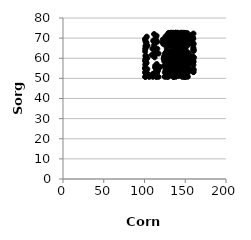
| Category | Series 0 |
|---|---|
| 136.72777560908997 | 69.507 |
| 130.25405878217626 | 67.39 |
| 138.38169360817292 | 51.266 |
| 147.95466621825304 | 70.231 |
| 157.93652203945828 | 68.69 |
| 145.1142160764156 | 61.77 |
| 102.15362811644198 | 61.149 |
| 127.79622655462948 | 69.228 |
| 159.40141447130028 | 59.395 |
| 139.8572153171643 | 65.665 |
| 140.04410825100643 | 63.404 |
| 125.28839167046857 | 58.538 |
| 154.35502141300222 | 67.321 |
| 101.50018633640991 | 53.443 |
| 126.73089541599688 | 68.853 |
| 133.78302110138736 | 56.378 |
| 100.81534180641341 | 54.749 |
| 135.9106538261241 | 53.562 |
| 144.70163184472543 | 69.403 |
| 137.67380770594968 | 58.314 |
| 125.8161522658447 | 54.197 |
| 144.47358134687306 | 70.509 |
| 101.28371883580245 | 58.985 |
| 116.55865361353845 | 54.092 |
| 150.19531930577875 | 68.508 |
| 127.9652267120658 | 50.885 |
| 132.53426273231733 | 59.396 |
| 132.25624815754523 | 60.445 |
| 147.7332097175809 | 61.745 |
| 134.77266203290574 | 60.467 |
| 130.50245933845278 | 72.513 |
| 128.92963068216812 | 67.349 |
| 128.07707935208498 | 58.422 |
| 159.48881929468297 | 70.04 |
| 101.25255429634939 | 65.175 |
| 102.60515078731365 | 57.702 |
| 152.03792089943082 | 70.535 |
| 147.36515889946048 | 70.09 |
| 132.33229366168916 | 55.952 |
| 123.28457222858277 | 68.918 |
| 160.3874768311301 | 60.376 |
| 100.71342991222684 | 52.929 |
| 137.7502930527938 | 70.521 |
| 111.45653751353935 | 52.238 |
| 133.23792423907062 | 61.976 |
| 124.28939290886308 | 58.458 |
| 150.37475608348595 | 70.229 |
| 145.82940093065787 | 66.606 |
| 134.61403264303803 | 63.3 |
| 102.78140307507637 | 70.729 |
| 147.80649185456153 | 67.702 |
| 135.07020181585025 | 56.597 |
| 134.94941046811618 | 54.104 |
| 127.94194534569507 | 56.036 |
| 105.71737378688425 | 50.742 |
| 150.35580454033305 | 52.365 |
| 151.16893175716208 | 55.976 |
| 142.37378215201423 | 67.616 |
| 149.49649763692324 | 71.825 |
| 134.2863159495147 | 60.282 |
| 139.28961793121934 | 67.959 |
| 136.24550839912322 | 71.152 |
| 133.08947951596048 | 55.778 |
| 153.78992681641517 | 61.882 |
| 160.0875590081285 | 53.113 |
| 149.54992638110843 | 65.933 |
| 148.02626354366294 | 69.292 |
| 141.4202918124553 | 69.028 |
| 151.8277004785291 | 69.604 |
| 140.81856470674865 | 62.005 |
| 130.8034514433382 | 68.269 |
| 135.4874719952224 | 59.609 |
| 133.58334572011807 | 68.792 |
| 139.24318246746913 | 68.572 |
| 142.11472846057399 | 61.225 |
| 115.02285806673206 | 57.121 |
| 127.75033827182104 | 67.531 |
| 101.16738249184034 | 68.398 |
| 124.707117973276 | 50.881 |
| 113.29790006227597 | 52.934 |
| 135.85412379999866 | 50.867 |
| 150.9299808003734 | 69.667 |
| 128.14687129542176 | 54.654 |
| 134.17156031287078 | 55.047 |
| 150.0737167668923 | 56.944 |
| 139.379389662458 | 56.073 |
| 131.414594250678 | 72.482 |
| 129.06022883741545 | 55.399 |
| 127.39636146210849 | 58.502 |
| 159.99789712811204 | 67.477 |
| 150.6932941827846 | 50.756 |
| 127.20123820496103 | 68.403 |
| 139.78921634008884 | 68.528 |
| 150.72189384811423 | 72.569 |
| 142.23229969795852 | 57.835 |
| 131.46871683967078 | 71.186 |
| 149.9092281695046 | 61.355 |
| 133.89787231306406 | 66.978 |
| 135.79133216996703 | 63.174 |
| 129.96167330858876 | 67.093 |
| 151.93471986193705 | 52.59 |
| 141.930859695245 | 64.114 |
| 140.2839199443765 | 54.352 |
| 128.24707921056554 | 67.97 |
| 140.3680052826824 | 67.025 |
| 134.0116940751758 | 59.77 |
| 154.97183677798196 | 69.796 |
| 112.21171621740429 | 63.433 |
| 131.8054861013131 | 59.814 |
| 126.56712252140473 | 53.349 |
| 138.01859751937292 | 63.559 |
| 112.67216486692249 | 67.432 |
| 137.7942676853786 | 72.589 |
| 157.35942402765727 | 67.558 |
| 137.3894701453518 | 69.279 |
| 152.8102267967633 | 57.262 |
| 147.33171712768572 | 52.351 |
| 143.32680736872595 | 68.175 |
| 116.10248756436845 | 53.588 |
| 130.66333557342492 | 51.482 |
| 130.86671252200975 | 57.68 |
| 148.7956572108479 | 71.963 |
| 136.87006422182677 | 54.93 |
| 126.37398184598732 | 62.47 |
| 153.34535442886278 | 68.705 |
| 122.58075005686965 | 69.325 |
| 141.45977721457217 | 67.311 |
| 151.50835921797002 | 72.143 |
| 125.38759487186823 | 59.098 |
| 134.8285107953695 | 60.286 |
| 100.97250844544286 | 64.557 |
| 135.55787959838037 | 67.548 |
| 137.86232958437208 | 54.956 |
| 140.3097129099747 | 72.15 |
| 100.88232252621587 | 58.586 |
| 135.4146533341257 | 71.092 |
| 137.0851027570549 | 60.574 |
| 136.47402366489746 | 65.992 |
| 126.43678034351336 | 67.313 |
| 125.04145969882599 | 67.675 |
| 111.8529160985858 | 66.56 |
| 156.868938690456 | 61.286 |
| 130.43679552684986 | 66.216 |
| 110.79877324021513 | 68.754 |
| 108.90131599607886 | 61.607 |
| 148.46403225619633 | 60.004 |
| 139.5413068646756 | 67.84 |
| 132.75611313151987 | 58.665 |
| 137.91613160185298 | 52.75 |
| 136.9105351589857 | 60.017 |
| 145.99603376527202 | 59.659 |
| 141.12416797768492 | 56.428 |
| 141.62469291677826 | 51.171 |
| 127.02813614363255 | 65.428 |
| 124.75447566850603 | 59.108 |
| 159.83999402456314 | 65.361 |
| 111.0742641589613 | 68.534 |
| 148.8388610940649 | 50.736 |
| 128.63928830668584 | 68.312 |
| 146.16825438621183 | 70.116 |
| 135.18364402585493 | 50.783 |
| 156.094541212219 | 69.312 |
| 126.30045021517984 | 62.572 |
| 134.38158437134146 | 68.962 |
| 131.73822225549904 | 56.075 |
| 149.00731558075321 | 53.229 |
| 141.58920418692512 | 62.487 |
| 129.97256776867596 | 72.58 |
| 128.37914309824305 | 53.307 |
| 132.86326003914817 | 72.678 |
| 133.03928180815888 | 72.221 |
| 141.19417621864974 | 67.617 |
| 101.09688963087078 | 59.658 |
| 101.23304910492794 | 52.744 |
| 125.67245997259612 | 70.293 |
| 132.98849149892737 | 69.195 |
| 147.02350131736472 | 54.291 |
| 160.294431387843 | 63.584 |
| 135.3559554575523 | 67.036 |
| 135.68021748421793 | 61.532 |
| 112.4044261915423 | 68.236 |
| 160.21596067294055 | 64.698 |
| 138.2928754146031 | 50.901 |
| 154.46749718603354 | 69.084 |
| 147.20070964958668 | 68.781 |
| 136.60035700497232 | 60.417 |
| 140.8759249942207 | 55.05 |
| 131.98203322935842 | 59.408 |
| 141.01433734756617 | 68.866 |
| 137.99653281654867 | 67.546 |
| 103.42895543191592 | 54.609 |
| 146.7627191126142 | 56.618 |
| 154.21183249798435 | 57.159 |
| 110.27000686381727 | 50.777 |
| 149.08899466941457 | 57.754 |
| 146.3999171335376 | 61.009 |
| 133.6647224354903 | 59.148 |
| 148.95342366598382 | 69.485 |
| 144.88548215327185 | 70.036 |
| 157.66548405801225 | 70.857 |
| 124.49398654350618 | 67.931 |
| 112.86309463005695 | 55.448 |
| 147.44872808326278 | 68.42 |
| 138.73899249562572 | 59.43 |
| 114.58257769349129 | 50.829 |
| 134.09859955995717 | 53.41 |
| 160.13963163325528 | 60.656 |
| 142.1862335375063 | 54.365 |
| 158.42673885592083 | 67.813 |
| 137.03247626093622 | 66.665 |
| 136.1035780443579 | 50.844 |
| 136.19719292959445 | 68.732 |
| 145.75130538555214 | 61.692 |
| 139.06286478962096 | 58.651 |
| 140.1264058857665 | 65.96 |
| 129.21017166938628 | 71.418 |
| 138.77742327838408 | 50.908 |
| 147.57482526168798 | 67.864 |
| 133.17118998172668 | 59.526 |
| 127.15090068320242 | 55.991 |
| 129.7193755104452 | 52.299 |
| 148.58420040496577 | 60.652 |
| 127.24715526236838 | 63.77 |
| 135.2978696790249 | 61.003 |
| 136.55806966271945 | 69.684 |
| 158.6707102916834 | 70.812 |
| 113.42867826336169 | 62.046 |
| 145.34752935412249 | 66.057 |
| 135.01697237544684 | 69.543 |
| 112.43770939449796 | 60.465 |
| 147.63390152842533 | 66.601 |
| 100.85701897183876 | 50.761 |
| 157.62704746407206 | 58.725 |
| 146.89515475073546 | 68.285 |
| 138.60256218758408 | 64.955 |
| 153.5446167841751 | 59.507 |
| 130.05717505882228 | 54.524 |
| 126.91203700697896 | 52.879 |
| 135.98024862493932 | 72.393 |
| 152.19365919999734 | 69.724 |
| 134.81476023204013 | 57.032 |
| 132.34188431840653 | 68.573 |
| 152.6626840654045 | 52.351 |
| 159.92530830187889 | 59.215 |
| 134.54301365485964 | 56.084 |
| 134.082077809114 | 53.629 |
| 159.71599020812067 | 54.576 |
| 123.60969832434148 | 59.602 |
| 128.98884012510425 | 50.77 |
| 149.69784400502795 | 50.775 |
| 154.79463217735545 | 68.27 |
| 103.2680843771554 | 60.011 |
| 160.3553300332217 | 54.17 |
| 149.7201538773316 | 60.283 |
| 133.9431551510717 | 72.038 |
| 101.01117943995023 | 61.2 |
| 160.06378296876062 | 54.548 |
| 138.67576313235907 | 70.046 |
| 128.7915219617943 | 70.197 |
| 133.36564368604246 | 67.167 |
| 130.14895084103563 | 72.563 |
| 156.58255170919267 | 71.123 |
| 160.26401144901192 | 58.184 |
| 133.31524103595729 | 59.767 |
| 150.15669983614976 | 54.194 |
| 149.2009191058485 | 63.833 |
| 139.92440923745212 | 61.822 |
| 113.93781716664786 | 63.574 |
| 133.4255824370674 | 66.326 |
| 148.39985459528256 | 69.035 |
| 137.60431241087556 | 66.927 |
| 160.17623448556606 | 60.365 |
| 159.9750919794041 | 53.161 |
| 138.9825067238705 | 69.285 |
| 159.22290626200362 | 70.354 |
| 144.34190772967105 | 59.787 |
| 136.94913296547054 | 66.566 |
| 139.36016967747173 | 70.418 |
| 152.91634086984226 | 69.881 |
| 131.10525166130418 | 72.385 |
| 127.56485513710815 | 53.389 |
| 144.1801856878928 | 56.081 |
| 147.13311797005383 | 68.134 |
| 131.14758159734495 | 70.489 |
| 151.75690443147204 | 59.18 |
| 132.4495490335008 | 63.708 |
| 126.86777122413962 | 62.913 |
| 149.96018996207633 | 65.007 |
| 138.23394134371352 | 57.605 |
| 150.8018758188574 | 54.966 |
| 134.24947947080648 | 51.296 |
| 124.87536714856515 | 53.038 |
| 148.20944251347476 | 69.902 |
| 137.21388221814288 | 60.997 |
| 100.73693036295721 | 55.287 |
| 148.27472633779053 | 64.158 |
| 136.70047056261288 | 67.491 |
| 101.06434340366756 | 50.79 |
| 152.5457922750451 | 72.482 |
| 140.21600898301512 | 53.06 |
| 156.20664098222846 | 60.243 |
| 151.34964636017918 | 67.962 |
| 123.86897125424217 | 60.762 |
| 143.5870648978903 | 64.693 |
| 125.17576805293085 | 50.876 |
| 113.83111254201302 | 70.533 |
| 140.02332988655226 | 71.142 |
| 138.5102357413005 | 72.664 |
| 138.86254292677827 | 70.976 |
| 140.62786143021623 | 70.74 |
| 124.44819533027902 | 67.524 |
| 117.29679189547072 | 62.354 |
| 152.35152572575043 | 62.199 |
| 143.77977478654202 | 60.065 |
| 114.29646071947536 | 50.786 |
| 126.6591075439756 | 50.848 |
| 128.45295837674232 | 66.217 |
| 128.48938865877474 | 69.565 |
| 135.1445005587004 | 72.672 |
| 139.15806873069482 | 58.898 |
| 132.02678331781925 | 51.629 |
| 135.52123815577002 | 68.848 |
| 137.43400110627428 | 67.245 |
| 101.19052132284996 | 54.753 |
| 126.03563815922963 | 54.986 |
| 143.0773411158818 | 67.852 |
| 131.22522857353022 | 52.412 |
| 133.48937799079633 | 71.322 |
| 129.87783323960358 | 68.203 |
| 136.7577742070779 | 68.234 |
| 159.81152018154407 | 67.015 |
| 143.98044331602094 | 72.614 |
| 146.46990313666984 | 50.721 |
| 101.83631511536898 | 57.447 |
| 125.73057338774102 | 60.281 |
| 136.84744792673908 | 59.571 |
| 146.2005655920826 | 67.469 |
| 140.56358122924462 | 72.623 |
| 139.1124788607028 | 72.235 |
| 129.26958933747568 | 62.41 |
| 153.71010860309815 | 62.691 |
| 136.30872667465738 | 58.524 |
| 114.21022131244807 | 53.936 |
| 129.48868986085643 | 70.501 |
| 153.16906717415256 | 50.807 |
| 127.52678428421444 | 69.938 |
| 131.52990777960198 | 72.532 |
| 136.0078097003316 | 63.432 |
| 151.06465722807295 | 68.766 |
| 139.61922170932962 | 54.891 |
| 113.11801743403235 | 56.293 |
| 135.30666646687928 | 60.647 |
| 141.79412805173158 | 60.687 |
| 136.08092833008712 | 58.889 |
| 101.03790067491063 | 69.761 |
| 102.38466102688936 | 67.761 |
| 130.32294485951536 | 58.11 |
| 153.10840764897677 | 66.477 |
| 132.6630321246238 | 60.668 |
| 129.4390789791839 | 57.38 |
| 134.69609108829522 | 63.606 |
| 158.97487652057256 | 70.262 |
| 138.88716271640212 | 67.556 |
| 110.49781557713412 | 52.3 |
| 132.11784662995234 | 68.636 |
| 138.11865525672397 | 70.137 |
| 126.79184828398917 | 57.037 |
| 141.36227637605808 | 66.687 |
| 151.60668448946896 | 56.433 |
| 123.0478969138059 | 67.096 |
| 151.43767529204212 | 66.263 |
| 160.1274804412937 | 72.25 |
| 101.14066004718737 | 66.154 |
| 130.558560703027 | 60.03 |
| 111.75009983609777 | 72.004 |
| 127.6553528059353 | 56.26 |
| 142.83815957889735 | 64.136 |
| 159.8926401860598 | 69.665 |
| 129.81055693265947 | 69.966 |
| 144.61736422670856 | 58.631 |
| 152.41068053998092 | 69.403 |
| 137.3450473137796 | 63.101 |
| 123.74965836715417 | 60.13 |
| 128.1252775039633 | 69.816 |
| 140.76737182388325 | 56.566 |
| 149.45412463476328 | 63.24 |
| 125.96489801749703 | 70.896 |
| 143.63768613527307 | 54.891 |
| 152.1082982319243 | 69.266 |
| 148.49891155057233 | 72.658 |
| 129.13758940495424 | 70.153 |
| 135.19932822942994 | 57.307 |
| 125.58290591232883 | 59.402 |
| 155.43080886401444 | 69.331 |
| 133.69179690645248 | 68.159 |
| 113.5792879852127 | 68.608 |
| 134.91436318574904 | 68.544 |
| 137.5528713065134 | 51.399 |
| 146.64754356722912 | 53.893 |
| 101.9952103093856 | 67.835 |
| 134.38937838528696 | 68.891 |
| 139.7773371848331 | 72.529 |
| 129.56702179804225 | 60.44 |
| 149.78986294760503 | 72.577 |
| 136.39689771061623 | 64.227 |
| 122.07353989617997 | 67.894 |
| 100.94211543756494 | 69.493 |
| 137.63158185484124 | 68.346 |
| 130.72150563633585 | 66.437 |
| 159.87242434392508 | 64.264 |
| 137.11220803273508 | 54.784 |
| 145.482596094892 | 68.22 |
| 137.28496583837378 | 58.781 |
| 136.6488726123536 | 59.002 |
| 128.5741190610155 | 67.203 |
| 128.30028892849225 | 71.206 |
| 115.70891652857588 | 64.717 |
| 114.53397434498926 | 68.916 |
| 138.93943357465594 | 71.335 |
| 160.32928379774145 | 64.049 |
| 133.80058853291237 | 70.047 |
| 117.17963497824259 | 50.754 |
| 148.06530818110144 | 66.37 |
| 126.2324344924276 | 67.318 |
| 154.01199085857755 | 55.2 |
| 101.31805396723392 | 58.955 |
| 141.06791477989026 | 52.492 |
| 115.52100219193561 | 68.143 |
| 151.25130404958747 | 68.794 |
| 136.34025150856078 | 69.78 |
| 150.55080738457627 | 64.178 |
| 126.15224053800428 | 58.533 |
| 128.83054213236673 | 72.215 |
| 132.61358007851715 | 59.735 |
| 114.84697278054239 | 71.189 |
| 125.06645790639496 | 62.364 |
| 137.8526606291521 | 69.353 |
| 126.10242373130642 | 60.366 |
| 128.698756233966 | 61.021 |
| 126.4979382530174 | 62.813 |
| 141.84633498413555 | 69.964 |
| 150.47469484028622 | 68.096 |
| 127.3156432119271 | 70.504 |
| 139.51120896999066 | 65.347 |
| 115.38375709628504 | 52.705 |
| 125.4707841192663 | 69.744 |
| 142.4477609345835 | 69.563 |
| 100.76576938353622 | 63.442 |
| 131.3138653032593 | 59.65 |
| 132.81667871782923 | 52.351 |
| 138.43226628824456 | 55.465 |
| 138.19662126299178 | 65.528 |
| 136.14476078541378 | 50.813 |
| 127.04176391942148 | 67.51 |
| 138.08551082967142 | 72.645 |
| 149.36546268372177 | 58.082 |
| 131.92088498905812 | 70.642 |
| 146.58171729371938 | 62.019 |
| 139.66697808205436 | 62.432 |
| 135.83908003426004 | 68.934 |
| 160.24504370517286 | 67.017 |
| 135.70914424423555 | 53.475 |
| 124.11918701144303 | 56.211 |
| 134.5661114853897 | 59.005 |
| 100.91768116323352 | 56.855 |
| 155.8348397233449 | 53.884 |
| 145.6682023508074 | 72.693 |
| 137.15924870536932 | 67.69 |
| 138.32833107896005 | 68.013 |
| 127.88236284375189 | 56.602 |
| 129.633268498151 | 56.065 |
| 100.84414227770547 | 69.314 |
| 148.65803757647012 | 62.691 |
| 158.32970141617696 | 71.743 |
| 138.48851409217562 | 68.131 |
| 140.45641531097124 | 68.155 |
| 119.11039615364079 | 55.637 |
| 143.03981879387817 | 66.881 |
| 131.02421010083376 | 62.558 |
| 142.5859457879578 | 69.004 |
| 143.3152695363321 | 52.878 |
| 139.4266760381596 | 55.371 |
| 160.02809902165194 | 56.69 |
| 134.47057587002865 | 53.842 |
| 142.6895689858376 | 67.777 |
| 145.1499155865138 | 66.89 |
| 129.35183516761674 | 70.275 |
| 131.67971874711264 | 67.602 |
| 109.72165386961643 | 64.762 |
| 136.43951747135586 | 66.563 |
| 137.4669214688315 | 70.255 |
| 135.61884822301556 | 62.59 |
| 137.25514429019256 | 70.433 |
| 127.43120271607164 | 55.609 |
| 138.63856065443323 | 57.872 |
| 140.71109649396126 | 72.634 |
| 103.68948580708897 | 66.236 |
| 149.243616220685 | 70.844 |
| 155.2908947941982 | 69.991 |
| 104.24409753544015 | 52.18 |